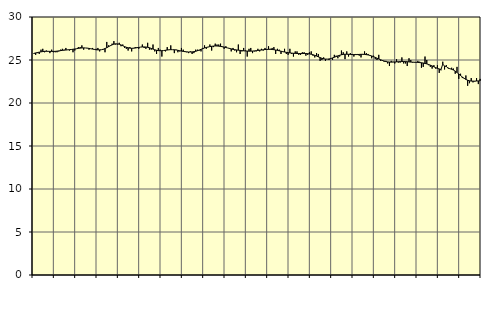
| Category | Piggar | Series 1 |
|---|---|---|
| nan | 25.7 | 25.77 |
| 1.0 | 25.6 | 25.82 |
| 1.0 | 25.8 | 25.87 |
| 1.0 | 25.7 | 25.91 |
| 1.0 | 26.2 | 25.95 |
| 1.0 | 26.3 | 25.98 |
| 1.0 | 25.9 | 26.01 |
| 1.0 | 26.1 | 26.01 |
| 1.0 | 26 | 26.01 |
| 1.0 | 25.8 | 26 |
| 1.0 | 26.2 | 26 |
| 1.0 | 25.9 | 26 |
| nan | 25.9 | 26.01 |
| 2.0 | 25.9 | 26.03 |
| 2.0 | 26 | 26.06 |
| 2.0 | 26.2 | 26.09 |
| 2.0 | 26.3 | 26.12 |
| 2.0 | 26.2 | 26.14 |
| 2.0 | 26.4 | 26.16 |
| 2.0 | 26.2 | 26.18 |
| 2.0 | 26.1 | 26.2 |
| 2.0 | 26.2 | 26.22 |
| 2.0 | 25.9 | 26.25 |
| 2.0 | 26.1 | 26.28 |
| nan | 26.3 | 26.31 |
| 3.0 | 26.5 | 26.35 |
| 3.0 | 26.5 | 26.38 |
| 3.0 | 26.7 | 26.4 |
| 3.0 | 26.2 | 26.41 |
| 3.0 | 26.4 | 26.4 |
| 3.0 | 26.4 | 26.38 |
| 3.0 | 26.2 | 26.35 |
| 3.0 | 26.3 | 26.31 |
| 3.0 | 26.4 | 26.27 |
| 3.0 | 26.2 | 26.23 |
| 3.0 | 26.3 | 26.19 |
| nan | 26.4 | 26.18 |
| 4.0 | 26 | 26.18 |
| 4.0 | 26.2 | 26.2 |
| 4.0 | 26.2 | 26.25 |
| 4.0 | 25.9 | 26.33 |
| 4.0 | 27.1 | 26.43 |
| 4.0 | 26.7 | 26.55 |
| 4.0 | 26.7 | 26.66 |
| 4.0 | 26.9 | 26.76 |
| 4.0 | 27.2 | 26.84 |
| 4.0 | 26.8 | 26.88 |
| 4.0 | 26.8 | 26.87 |
| nan | 27 | 26.83 |
| 5.0 | 26.6 | 26.75 |
| 5.0 | 26.8 | 26.66 |
| 5.0 | 26.4 | 26.56 |
| 5.0 | 26.3 | 26.48 |
| 5.0 | 26.1 | 26.42 |
| 5.0 | 26.5 | 26.38 |
| 5.0 | 26 | 26.36 |
| 5.0 | 26.4 | 26.37 |
| 5.0 | 26.5 | 26.39 |
| 5.0 | 26.5 | 26.43 |
| 5.0 | 26.3 | 26.46 |
| nan | 26.5 | 26.5 |
| 6.0 | 26.8 | 26.52 |
| 6.0 | 26.4 | 26.52 |
| 6.0 | 26.3 | 26.51 |
| 6.0 | 27 | 26.48 |
| 6.0 | 26.2 | 26.42 |
| 6.0 | 26.2 | 26.35 |
| 6.0 | 26.8 | 26.27 |
| 6.0 | 26 | 26.19 |
| 6.0 | 25.7 | 26.13 |
| 6.0 | 26.4 | 26.09 |
| 6.0 | 26.2 | 26.08 |
| nan | 25.4 | 26.08 |
| 7.0 | 26.1 | 26.1 |
| 7.0 | 26 | 26.13 |
| 7.0 | 26.5 | 26.16 |
| 7.0 | 26.2 | 26.19 |
| 7.0 | 26.7 | 26.2 |
| 7.0 | 26.2 | 26.2 |
| 7.0 | 25.8 | 26.19 |
| 7.0 | 26.2 | 26.17 |
| 7.0 | 25.9 | 26.13 |
| 7.0 | 26 | 26.08 |
| 7.0 | 26.4 | 26.04 |
| nan | 26.2 | 26 |
| 8.0 | 26 | 25.97 |
| 8.0 | 25.9 | 25.95 |
| 8.0 | 25.8 | 25.93 |
| 8.0 | 26 | 25.93 |
| 8.0 | 25.7 | 25.94 |
| 8.0 | 25.8 | 25.97 |
| 8.0 | 26.2 | 26.01 |
| 8.0 | 26.2 | 26.08 |
| 8.0 | 26.1 | 26.16 |
| 8.0 | 26 | 26.24 |
| 8.0 | 26.4 | 26.32 |
| nan | 26.7 | 26.4 |
| 9.0 | 26.3 | 26.46 |
| 9.0 | 26.5 | 26.51 |
| 9.0 | 26.8 | 26.56 |
| 9.0 | 26.1 | 26.59 |
| 9.0 | 26.5 | 26.62 |
| 9.0 | 26.9 | 26.63 |
| 9.0 | 26.8 | 26.63 |
| 9.0 | 26.8 | 26.61 |
| 9.0 | 26.9 | 26.58 |
| 9.0 | 26.5 | 26.55 |
| 9.0 | 26.3 | 26.5 |
| nan | 26.6 | 26.45 |
| 10.0 | 26.4 | 26.4 |
| 10.0 | 26.3 | 26.35 |
| 10.0 | 26 | 26.29 |
| 10.0 | 26.4 | 26.24 |
| 10.0 | 26.1 | 26.2 |
| 10.0 | 25.9 | 26.17 |
| 10.0 | 26.8 | 26.14 |
| 10.0 | 25.7 | 26.12 |
| 10.0 | 26 | 26.09 |
| 10.0 | 26.4 | 26.07 |
| 10.0 | 26.1 | 26.05 |
| nan | 25.4 | 26.04 |
| 11.0 | 26.3 | 26.03 |
| 11.0 | 26.4 | 26.03 |
| 11.0 | 25.8 | 26.04 |
| 11.0 | 26 | 26.06 |
| 11.0 | 26 | 26.08 |
| 11.0 | 26.3 | 26.11 |
| 11.0 | 26 | 26.14 |
| 11.0 | 26.3 | 26.16 |
| 11.0 | 26.1 | 26.19 |
| 11.0 | 26.4 | 26.22 |
| 11.0 | 26.2 | 26.23 |
| nan | 26.6 | 26.24 |
| 12.0 | 26.3 | 26.24 |
| 12.0 | 26.4 | 26.22 |
| 12.0 | 26.5 | 26.2 |
| 12.0 | 25.7 | 26.16 |
| 12.0 | 26.3 | 26.12 |
| 12.0 | 26.2 | 26.07 |
| 12.0 | 25.7 | 26.02 |
| 12.0 | 26 | 25.97 |
| 12.0 | 26.3 | 25.93 |
| 12.0 | 25.7 | 25.89 |
| 12.0 | 25.6 | 25.85 |
| nan | 26.3 | 25.83 |
| 13.0 | 25.7 | 25.8 |
| 13.0 | 25.4 | 25.78 |
| 13.0 | 26 | 25.77 |
| 13.0 | 26 | 25.76 |
| 13.0 | 25.6 | 25.75 |
| 13.0 | 25.6 | 25.75 |
| 13.0 | 25.9 | 25.75 |
| 13.0 | 25.9 | 25.76 |
| 13.0 | 25.5 | 25.75 |
| 13.0 | 25.6 | 25.74 |
| 13.0 | 25.9 | 25.71 |
| nan | 26 | 25.67 |
| 14.0 | 25.5 | 25.61 |
| 14.0 | 25.3 | 25.54 |
| 14.0 | 25.8 | 25.46 |
| 14.0 | 25.7 | 25.37 |
| 14.0 | 24.9 | 25.28 |
| 14.0 | 25 | 25.2 |
| 14.0 | 25.3 | 25.14 |
| 14.0 | 24.9 | 25.11 |
| 14.0 | 25.1 | 25.1 |
| 14.0 | 25 | 25.12 |
| 14.0 | 25.2 | 25.17 |
| nan | 25 | 25.24 |
| 15.0 | 25.6 | 25.32 |
| 15.0 | 25.5 | 25.4 |
| 15.0 | 25.2 | 25.48 |
| 15.0 | 25.4 | 25.55 |
| 15.0 | 26.1 | 25.61 |
| 15.0 | 25.9 | 25.65 |
| 15.0 | 25.1 | 25.67 |
| 15.0 | 26 | 25.67 |
| 15.0 | 25.4 | 25.66 |
| 15.0 | 25.8 | 25.65 |
| 15.0 | 25.7 | 25.63 |
| nan | 25.4 | 25.63 |
| 16.0 | 25.7 | 25.63 |
| 16.0 | 25.7 | 25.63 |
| 16.0 | 25.5 | 25.65 |
| 16.0 | 25.3 | 25.66 |
| 16.0 | 25.7 | 25.66 |
| 16.0 | 26 | 25.65 |
| 16.0 | 25.8 | 25.62 |
| 16.0 | 25.7 | 25.59 |
| 16.0 | 25.5 | 25.53 |
| 16.0 | 25.2 | 25.47 |
| 16.0 | 25.5 | 25.39 |
| nan | 25.1 | 25.31 |
| 17.0 | 25 | 25.21 |
| 17.0 | 25.6 | 25.12 |
| 17.0 | 24.9 | 25.03 |
| 17.0 | 25 | 24.95 |
| 17.0 | 24.8 | 24.88 |
| 17.0 | 24.9 | 24.82 |
| 17.0 | 24.6 | 24.78 |
| 17.0 | 24.3 | 24.76 |
| 17.0 | 24.9 | 24.75 |
| 17.0 | 24.8 | 24.76 |
| 17.0 | 24.6 | 24.77 |
| nan | 25.1 | 24.79 |
| 18.0 | 24.7 | 24.8 |
| 18.0 | 24.7 | 24.81 |
| 18.0 | 25.3 | 24.82 |
| 18.0 | 24.6 | 24.82 |
| 18.0 | 24.6 | 24.81 |
| 18.0 | 24.3 | 24.8 |
| 18.0 | 25.2 | 24.78 |
| 18.0 | 25 | 24.76 |
| 18.0 | 24.7 | 24.75 |
| 18.0 | 24.7 | 24.74 |
| 18.0 | 24.7 | 24.73 |
| nan | 24.9 | 24.72 |
| 19.0 | 24.8 | 24.7 |
| 19.0 | 24.1 | 24.68 |
| 19.0 | 24.2 | 24.65 |
| 19.0 | 25.4 | 24.6 |
| 19.0 | 25 | 24.55 |
| 19.0 | 24.4 | 24.48 |
| 19.0 | 24.2 | 24.4 |
| 19.0 | 24 | 24.31 |
| 19.0 | 24.4 | 24.21 |
| 19.0 | 24 | 24.11 |
| 19.0 | 24.4 | 24.03 |
| nan | 23.5 | 23.96 |
| 20.0 | 23.8 | 23.9 |
| 20.0 | 24.8 | 24.53 |
| 20.0 | 23.9 | 24.28 |
| 20.0 | 24.4 | 24.25 |
| 20.0 | 24.1 | 24.04 |
| 20.0 | 24 | 23.99 |
| 20.0 | 24.1 | 23.92 |
| 20.0 | 24 | 23.83 |
| 20.0 | 23.4 | 23.7 |
| 20.0 | 24.2 | 23.55 |
| 20.0 | 22.8 | 23.37 |
| nan | 23.4 | 23.2 |
| 21.0 | 22.9 | 23.02 |
| 21.0 | 22.9 | 22.87 |
| 21.0 | 23.2 | 22.74 |
| 21.0 | 22 | 22.65 |
| 21.0 | 22.3 | 22.58 |
| 21.0 | 22.9 | 22.55 |
| 21.0 | 22.4 | 22.54 |
| 21.0 | 22.5 | 22.54 |
| 21.0 | 22.9 | 22.56 |
| 21.0 | 22.2 | 22.57 |
| 21.0 | 22.8 | 22.58 |